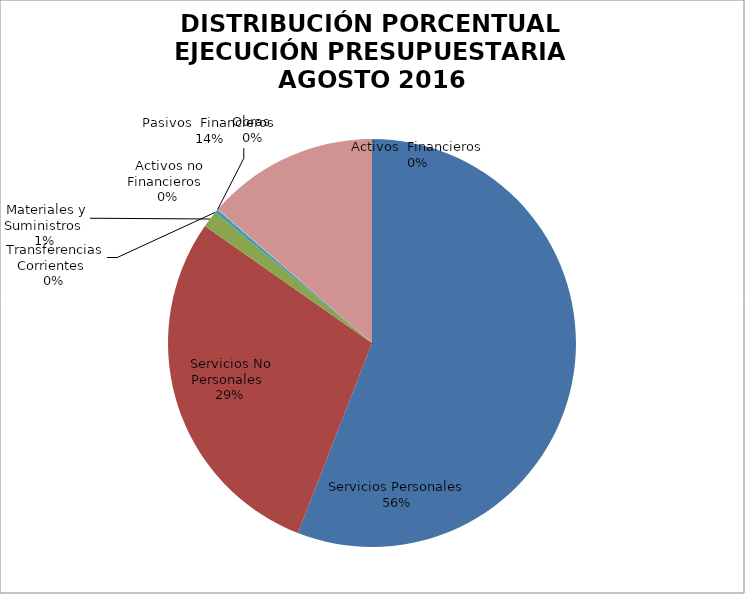
| Category | Series 0 | Series 1 |
|---|---|---|
| Servicios Personales | 12380857.19 | 0.768 |
| Servicios No Personales | 6377692.48 | 0.396 |
| Materiales y Suministros | 299877.22 | 0.019 |
| Transferencias Corrientes | 0 | 0 |
| Activos no Financieros | 55715.88 | 0.003 |
| Obras | 0 | 0 |
| Activos  Financieros | 17200 | 0.001 |
| Pasivos  Financieros | -3010594.6 | -0.187 |